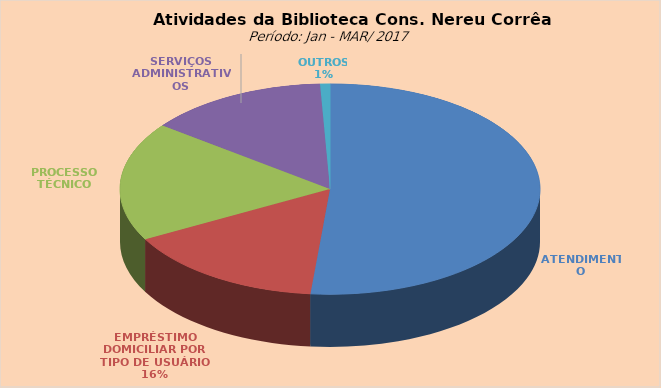
| Category | Series 0 |
|---|---|
| ATENDIMENTO | 4202 |
| EMPRÉSTIMO DOMICILIAR POR TIPO DE USUÁRIO | 1274 |
| PROCESSO TÉCNICO | 1488 |
| SERVIÇOS ADMINISTRATIVOS | 1136 |
| OUTROS | 62 |